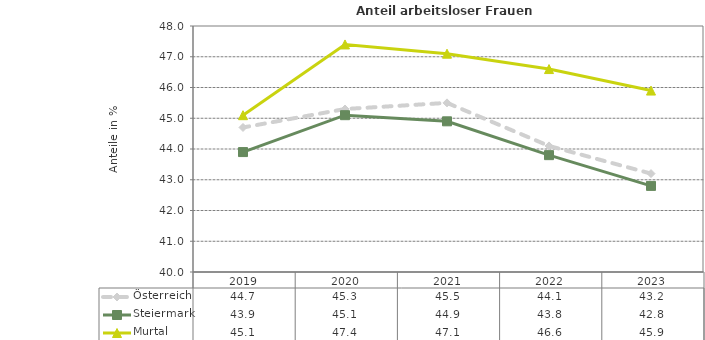
| Category | Österreich | Steiermark | Murtal |
|---|---|---|---|
| 2023.0 | 43.2 | 42.8 | 45.9 |
| 2022.0 | 44.1 | 43.8 | 46.6 |
| 2021.0 | 45.5 | 44.9 | 47.1 |
| 2020.0 | 45.3 | 45.1 | 47.4 |
| 2019.0 | 44.7 | 43.9 | 45.1 |